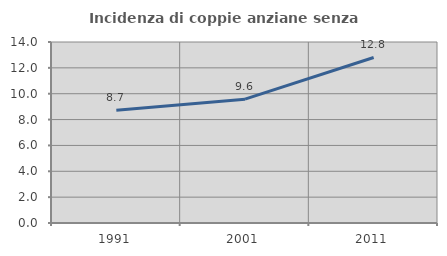
| Category | Incidenza di coppie anziane senza figli  |
|---|---|
| 1991.0 | 8.714 |
| 2001.0 | 9.576 |
| 2011.0 | 12.803 |